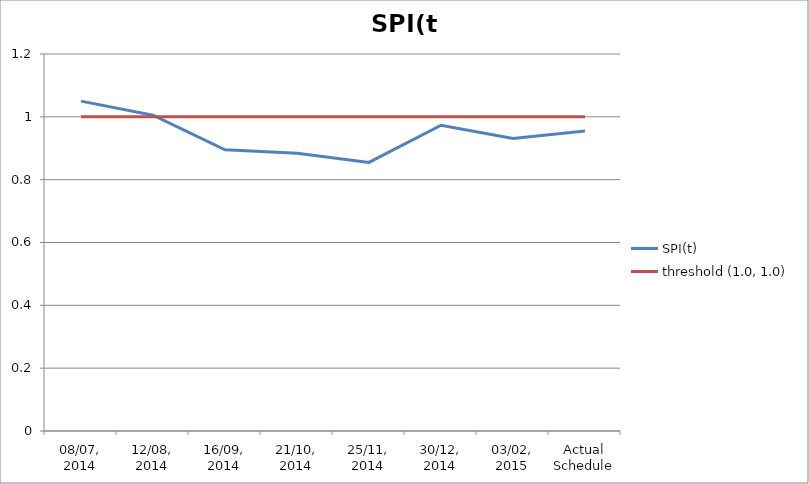
| Category | SPI(t) | threshold (1.0, 1.0) |
|---|---|---|
| 08/07, 2014 | 1.05 | 1 |
| 12/08, 2014 | 1.005 | 1 |
| 16/09, 2014 | 0.895 | 1 |
| 21/10, 2014 | 0.884 | 1 |
| 25/11, 2014 | 0.855 | 1 |
| 30/12, 2014 | 0.973 | 1 |
| 03/02, 2015 | 0.931 | 1 |
| Actual Schedule | 0.955 | 1 |